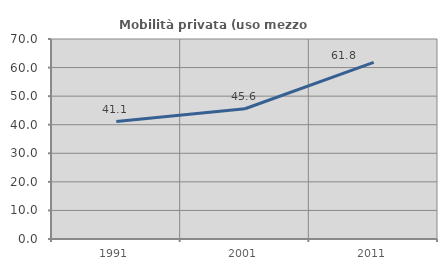
| Category | Mobilità privata (uso mezzo privato) |
|---|---|
| 1991.0 | 41.121 |
| 2001.0 | 45.584 |
| 2011.0 | 61.812 |